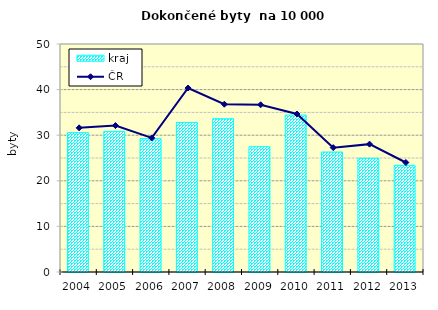
| Category | kraj |
|---|---|
| 2004.0 | 30.564 |
| 2005.0 | 30.843 |
| 2006.0 | 29.25 |
| 2007.0 | 32.796 |
| 2008.0 | 33.613 |
| 2009.0 | 27.478 |
| 2010.0 | 34.421 |
| 2011.0 | 26.31 |
| 2012.0 | 24.94 |
| 2013.0 | 23.388 |